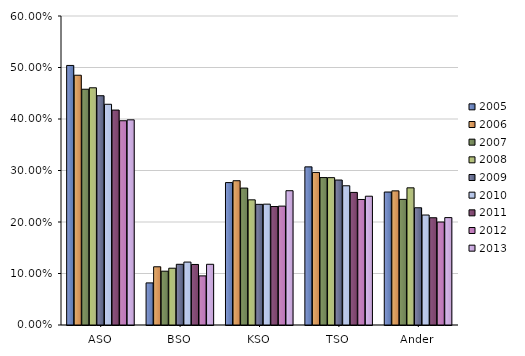
| Category | 2005 | 2006 | 2007 | 2008 | 2009 | 2010 | 2011 | 2012 | 2013 |
|---|---|---|---|---|---|---|---|---|---|
| ASO | 0.504 | 0.485 | 0.458 | 0.461 | 0.445 | 0.429 | 0.417 | 0.397 | 0.398 |
| BSO | 0.082 | 0.113 | 0.104 | 0.11 | 0.118 | 0.122 | 0.118 | 0.095 | 0.118 |
| KSO | 0.277 | 0.28 | 0.266 | 0.243 | 0.234 | 0.235 | 0.23 | 0.231 | 0.261 |
| TSO | 0.307 | 0.296 | 0.286 | 0.286 | 0.282 | 0.27 | 0.257 | 0.244 | 0.25 |
| Ander | 0.258 | 0.26 | 0.244 | 0.266 | 0.228 | 0.214 | 0.208 | 0.2 | 0.209 |